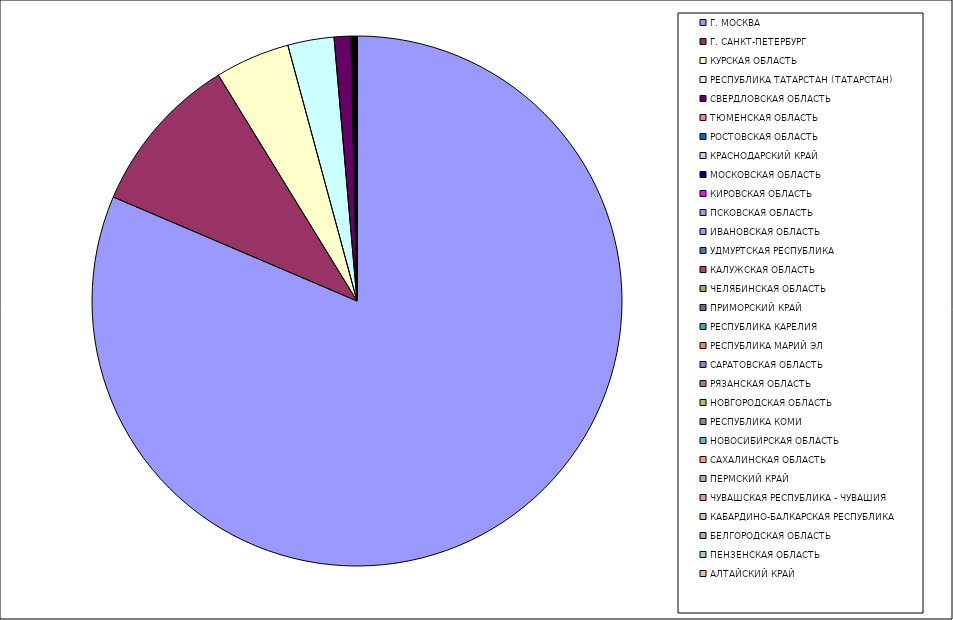
| Category | Оборот |
|---|---|
| Г. МОСКВА | 81.412 |
| Г. САНКТ-ПЕТЕРБУРГ | 9.819 |
| КУРСКАЯ ОБЛАСТЬ | 4.558 |
| РЕСПУБЛИКА ТАТАРСТАН (ТАТАРСТАН) | 2.819 |
| СВЕРДЛОВСКАЯ ОБЛАСТЬ | 1.009 |
| ТЮМЕНСКАЯ ОБЛАСТЬ | 0.076 |
| РОСТОВСКАЯ ОБЛАСТЬ | 0.038 |
| КРАСНОДАРСКИЙ КРАЙ | 0.027 |
| МОСКОВСКАЯ ОБЛАСТЬ | 0.026 |
| КИРОВСКАЯ ОБЛАСТЬ | 0.026 |
| ПСКОВСКАЯ ОБЛАСТЬ | 0.022 |
| ИВАНОВСКАЯ ОБЛАСТЬ | 0.022 |
| УДМУРТСКАЯ РЕСПУБЛИКА | 0.019 |
| КАЛУЖСКАЯ ОБЛАСТЬ | 0.016 |
| ЧЕЛЯБИНСКАЯ ОБЛАСТЬ | 0.015 |
| ПРИМОРСКИЙ КРАЙ | 0.011 |
| РЕСПУБЛИКА КАРЕЛИЯ | 0.011 |
| РЕСПУБЛИКА МАРИЙ ЭЛ | 0.011 |
| САРАТОВСКАЯ ОБЛАСТЬ | 0.008 |
| РЯЗАНСКАЯ ОБЛАСТЬ | 0.008 |
| НОВГОРОДСКАЯ ОБЛАСТЬ | 0.006 |
| РЕСПУБЛИКА КОМИ | 0.006 |
| НОВОСИБИРСКАЯ ОБЛАСТЬ | 0.004 |
| САХАЛИНСКАЯ ОБЛАСТЬ | 0.004 |
| ПЕРМСКИЙ КРАЙ | 0.004 |
| ЧУВАШСКАЯ РЕСПУБЛИКА - ЧУВАШИЯ | 0.004 |
| КАБАРДИНО-БАЛКАРСКАЯ РЕСПУБЛИКА | 0.004 |
| БЕЛГОРОДСКАЯ ОБЛАСТЬ | 0.003 |
| ПЕНЗЕНСКАЯ ОБЛАСТЬ | 0.003 |
| АЛТАЙСКИЙ КРАЙ | 0.002 |